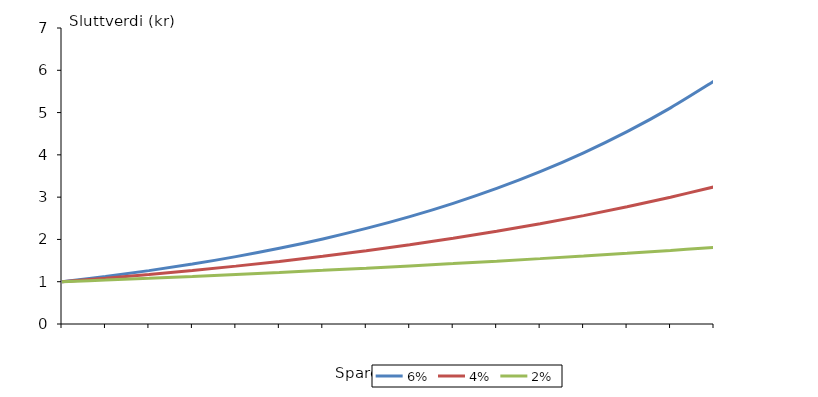
| Category | 6 % | 4 % | 2 % |
|---|---|---|---|
| nan | 1 | 1 | 1 |
| 2.0 | 1.124 | 1.082 | 1.04 |
| 4.0 | 1.262 | 1.17 | 1.082 |
| 6.0 | 1.419 | 1.265 | 1.126 |
| 8.0 | 1.594 | 1.369 | 1.172 |
| 10.0 | 1.791 | 1.48 | 1.219 |
| 12.0 | 2.012 | 1.601 | 1.268 |
| 14.0 | 2.261 | 1.732 | 1.319 |
| 16.0 | 2.54 | 1.873 | 1.373 |
| 18.0 | 2.854 | 2.026 | 1.428 |
| 20.0 | 3.207 | 2.191 | 1.486 |
| 22.0 | 3.604 | 2.37 | 1.546 |
| 24.0 | 4.049 | 2.563 | 1.608 |
| 26.0 | 4.549 | 2.772 | 1.673 |
| 28.0 | 5.112 | 2.999 | 1.741 |
| 30.0 | 5.743 | 3.243 | 1.811 |